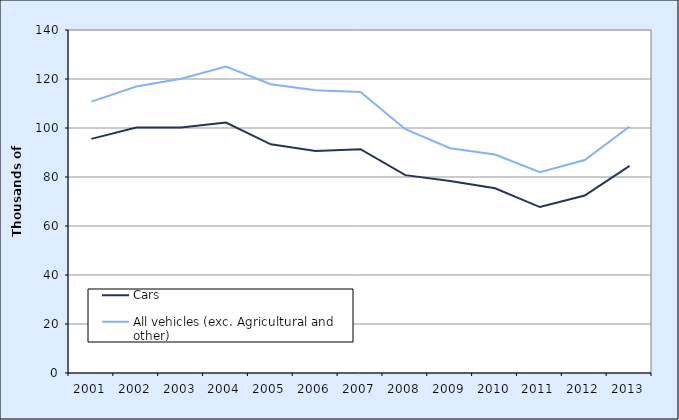
| Category | Cars | All vehicles (exc. Agricultural and other) |
|---|---|---|
| 2001.0 | 95.573 | 110.765 |
| 2002.0 | 100.196 | 116.925 |
| 2003.0 | 100.198 | 120.14 |
| 2004.0 | 102.226 | 125.124 |
| 2005.0 | 93.348 | 117.861 |
| 2006.0 | 90.636 | 115.372 |
| 2007.0 | 91.337 | 114.734 |
| 2008.0 | 80.764 | 99.52 |
| 2009.0 | 78.368 | 91.763 |
| 2010.0 | 75.371 | 89.201 |
| 2011.0 | 67.727 | 81.925 |
| 2012.0 | 72.438 | 86.926 |
| 2013.0 | 84.558 | 100.64 |